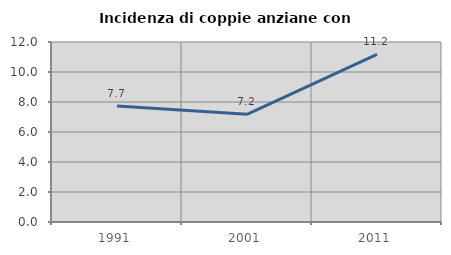
| Category | Incidenza di coppie anziane con figli |
|---|---|
| 1991.0 | 7.735 |
| 2001.0 | 7.179 |
| 2011.0 | 11.176 |